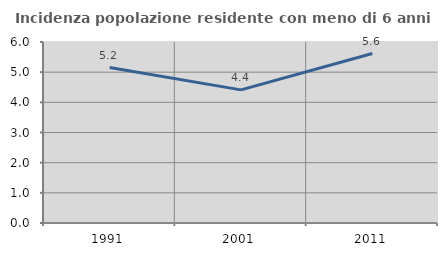
| Category | Incidenza popolazione residente con meno di 6 anni |
|---|---|
| 1991.0 | 5.153 |
| 2001.0 | 4.413 |
| 2011.0 | 5.618 |